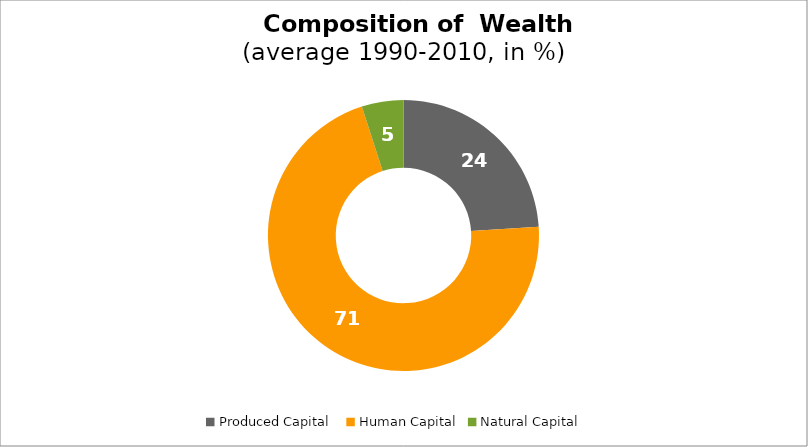
| Category | Series 0 |
|---|---|
| Produced Capital  | 23.971 |
| Human Capital | 71.053 |
| Natural Capital | 4.975 |